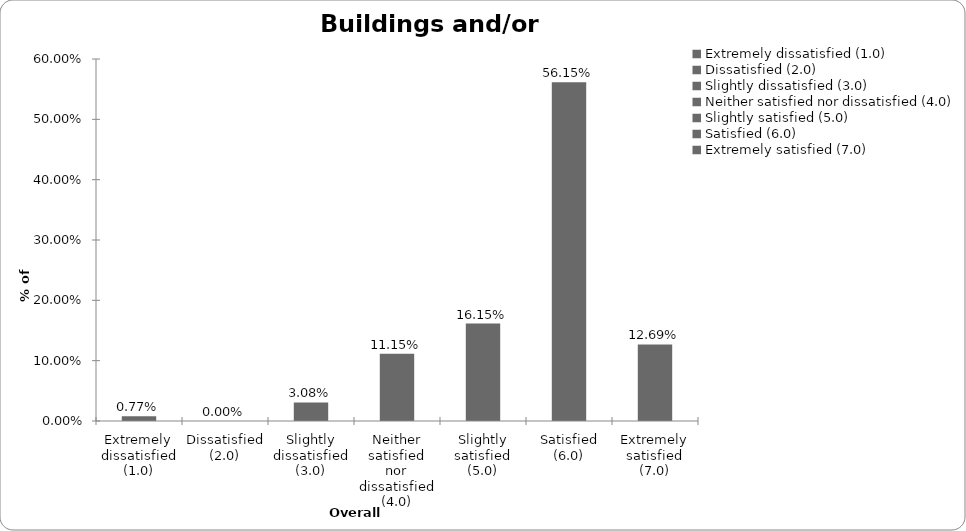
| Category | Series 0 |
|---|---|
| Extremely dissatisfied (1.0) | 0.008 |
| Dissatisfied (2.0) | 0 |
| Slightly dissatisfied (3.0) | 0.031 |
| Neither satisfied nor dissatisfied (4.0) | 0.112 |
| Slightly satisfied (5.0) | 0.162 |
| Satisfied (6.0) | 0.562 |
| Extremely satisfied (7.0) | 0.127 |